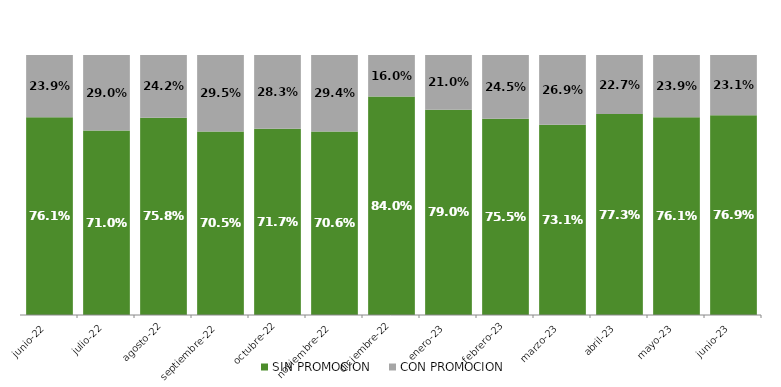
| Category | SIN PROMOCION   | CON PROMOCION   |
|---|---|---|
| 2022-06-01 | 0.761 | 0.239 |
| 2022-07-01 | 0.71 | 0.29 |
| 2022-08-01 | 0.758 | 0.242 |
| 2022-09-01 | 0.705 | 0.295 |
| 2022-10-01 | 0.717 | 0.283 |
| 2022-11-01 | 0.706 | 0.294 |
| 2022-12-01 | 0.84 | 0.16 |
| 2023-01-01 | 0.79 | 0.21 |
| 2023-02-01 | 0.755 | 0.245 |
| 2023-03-01 | 0.731 | 0.269 |
| 2023-04-01 | 0.773 | 0.227 |
| 2023-05-01 | 0.761 | 0.239 |
| 2023-06-01 | 0.769 | 0.231 |